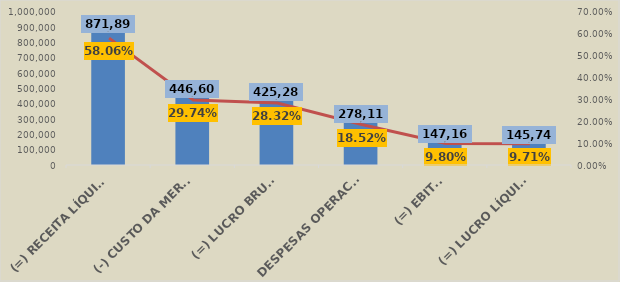
| Category | Em R$ 1 |
|---|---|
| (=) RECEITA LÍQUIDA DE VENDAS | 871889.78 |
| (-) CUSTO DA MERCADORIA VENDIDA (CMV) | 446608.72 |
| (=) LUCRO BRUTO | 425281.06 |
| DESPESAS OPERACIONAIS | 278116.028 |
| (=) EBITDA | 147165.032 |
| (=) LUCRO LÍQUIDO | 145743.012 |